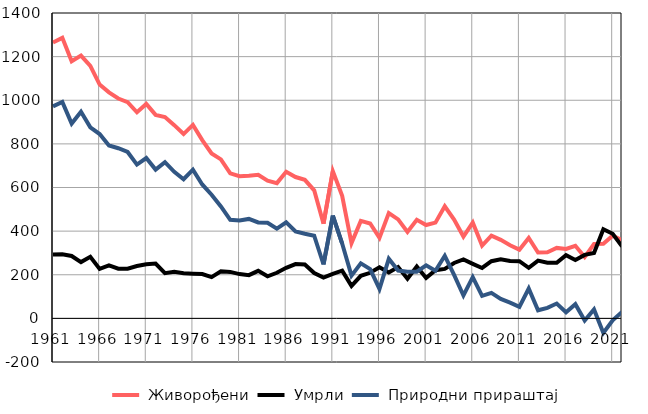
| Category |  Живорођени |  Умрли |  Природни прираштај |
|---|---|---|---|
| 1961.0 | 1265 | 293 | 972 |
| 1962.0 | 1286 | 294 | 992 |
| 1963.0 | 1179 | 286 | 893 |
| 1964.0 | 1205 | 258 | 947 |
| 1965.0 | 1158 | 282 | 876 |
| 1966.0 | 1072 | 227 | 845 |
| 1967.0 | 1036 | 243 | 793 |
| 1968.0 | 1008 | 228 | 780 |
| 1969.0 | 991 | 228 | 763 |
| 1970.0 | 945 | 240 | 705 |
| 1971.0 | 983 | 248 | 735 |
| 1972.0 | 933 | 251 | 682 |
| 1973.0 | 923 | 207 | 716 |
| 1974.0 | 886 | 214 | 672 |
| 1975.0 | 845 | 207 | 638 |
| 1976.0 | 887 | 205 | 682 |
| 1977.0 | 817 | 203 | 614 |
| 1978.0 | 756 | 189 | 567 |
| 1979.0 | 729 | 216 | 513 |
| 1980.0 | 665 | 213 | 452 |
| 1981.0 | 652 | 203 | 449 |
| 1982.0 | 654 | 198 | 456 |
| 1983.0 | 658 | 218 | 440 |
| 1984.0 | 631 | 193 | 438 |
| 1985.0 | 620 | 209 | 411 |
| 1986.0 | 672 | 232 | 440 |
| 1987.0 | 648 | 249 | 399 |
| 1988.0 | 635 | 247 | 388 |
| 1989.0 | 587 | 208 | 379 |
| 1990.0 | 434 | 187 | 247 |
| 1991.0 | 675 | 204 | 471 |
| 1992.0 | 562 | 219 | 343 |
| 1993.0 | 345 | 149 | 196 |
| 1994.0 | 447 | 195 | 252 |
| 1995.0 | 435 | 209 | 226 |
| 1996.0 | 369 | 234 | 135 |
| 1997.0 | 483 | 210 | 273 |
| 1998.0 | 454 | 235 | 219 |
| 1999.0 | 396 | 182 | 214 |
| 2000.0 | 452 | 238 | 214 |
| 2001.0 | 428 | 185 | 243 |
| 2002.0 | 439 | 221 | 218 |
| 2003.0 | 514 | 227 | 287 |
| 2004.0 | 453 | 254 | 199 |
| 2005.0 | 375 | 270 | 105 |
| 2006.0 | 439 | 250 | 189 |
| 2007.0 | 334 | 231 | 103 |
| 2008.0 | 379 | 262 | 117 |
| 2009.0 | 360 | 271 | 89 |
| 2010.0 | 335 | 263 | 72 |
| 2011.0 | 315 | 262 | 53 |
| 2012.0 | 369 | 232 | 137 |
| 2013.0 | 302 | 265 | 37 |
| 2014.0 | 303 | 255 | 48 |
| 2015.0 | 323 | 255 | 68 |
| 2016.0 | 318 | 290 | 28 |
| 2017.0 | 333 | 268 | 65 |
| 2018.0 | 281 | 291 | -10 |
| 2019.0 | 341 | 300 | 41 |
| 2020.0 | 342 | 409 | -67 |
| 2021.0 | 379 | 388 | -9 |
| 2022.0 | 359 | 330 | 29 |